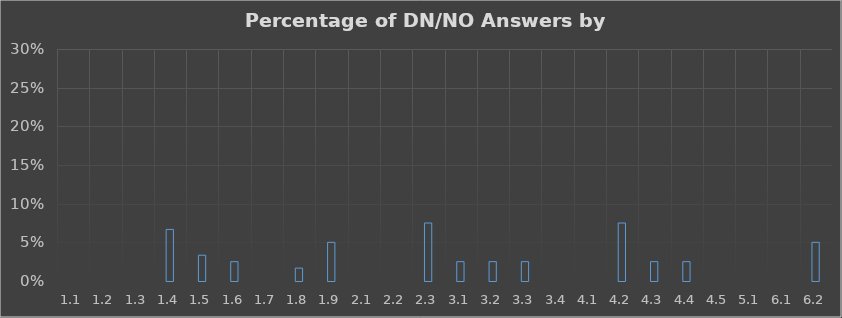
| Category | Series 0 |
|---|---|
| 1.1 | 0 |
| 1.2 | 0 |
| 1.3 | 0 |
| 1.4 | 0.067 |
| 1.5 | 0.033 |
| 1.6 | 0.025 |
| 1.7 | 0 |
| 1.8 | 0.017 |
| 1.9 | 0.05 |
| 2.1 | 0 |
| 2.2 | 0 |
| 2.3 | 0.075 |
| 3.1 | 0.025 |
| 3.2 | 0.025 |
| 3.3 | 0.025 |
| 3.4 | 0 |
| 4.1 | 0 |
| 4.2 | 0.075 |
| 4.3 | 0.025 |
| 4.4 | 0.025 |
| 4.5 | 0 |
| 5.1 | 0 |
| 6.1 | 0 |
| 6.2 | 0.05 |